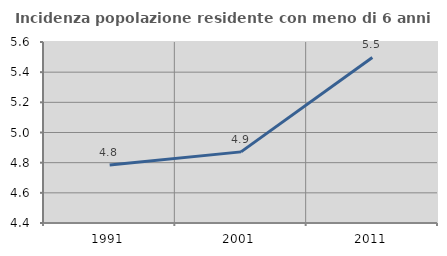
| Category | Incidenza popolazione residente con meno di 6 anni |
|---|---|
| 1991.0 | 4.784 |
| 2001.0 | 4.872 |
| 2011.0 | 5.498 |